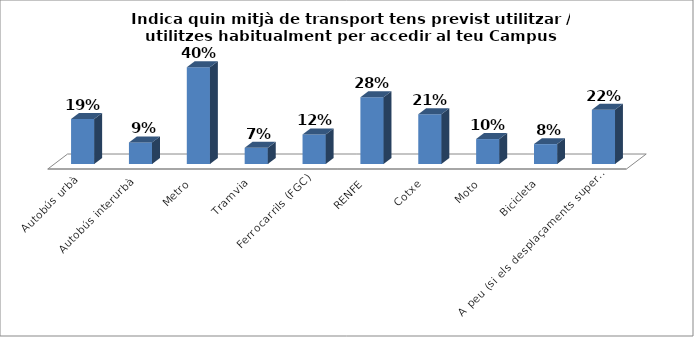
| Category | Series 0 |
|---|---|
| Autobús urbà | 0.185 |
| Autobús interurbà | 0.089 |
| Metro | 0.398 |
| Tramvia | 0.067 |
| Ferrocarrils (FGC) | 0.122 |
| RENFE | 0.276 |
| Cotxe | 0.206 |
| Moto | 0.103 |
| Bicicleta | 0.082 |
| A peu (si els desplaçaments superen els 5 min) | 0.224 |